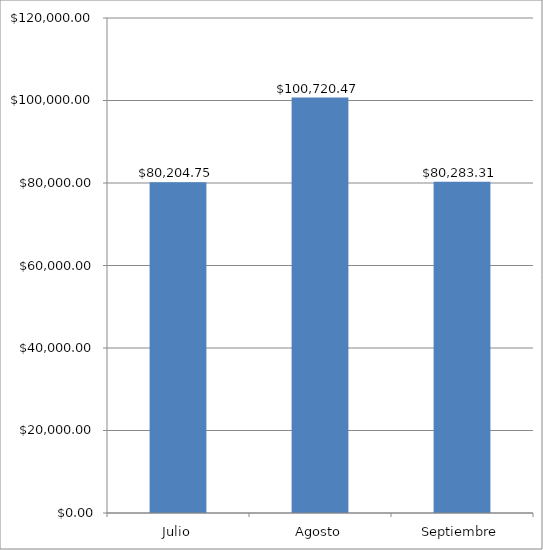
| Category | Series 0 |
|---|---|
| Julio | 80204.75 |
| Agosto | 100720.47 |
| Septiembre | 80283.31 |